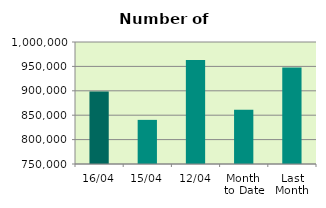
| Category | Series 0 |
|---|---|
| 16/04 | 898614 |
| 15/04 | 840424 |
| 12/04 | 962928 |
| Month 
to Date | 861285.5 |
| Last
Month | 947588.19 |